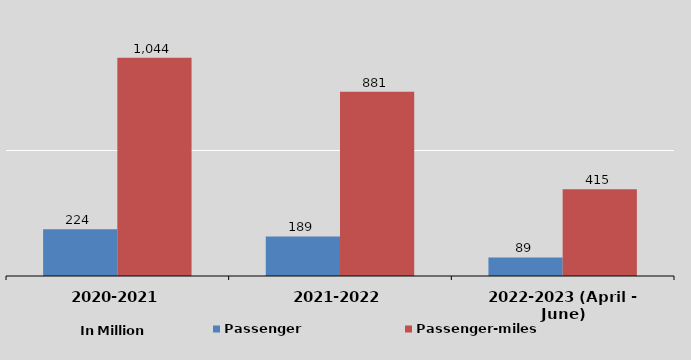
| Category | Passenger | Passenger-miles |
|---|---|---|
| 2020-2021 | 224 | 1044 |
| 2021-2022 | 189 | 881 |
| 2022-2023 (April - June) | 89 | 415 |